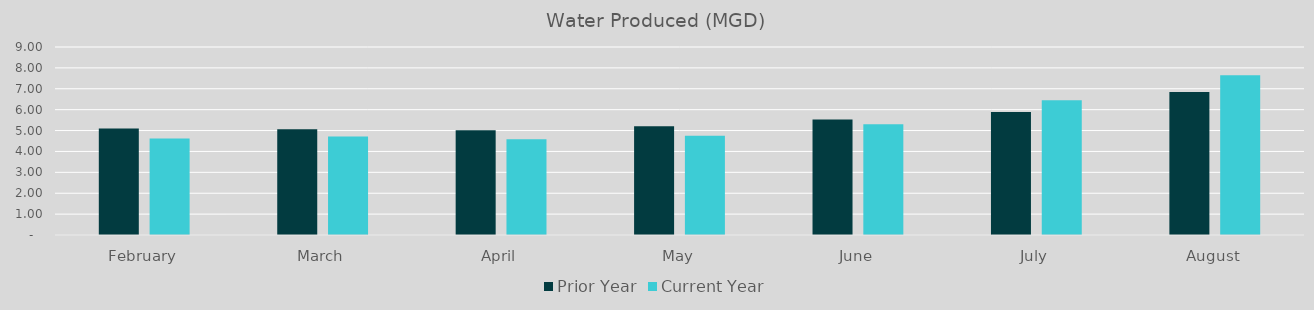
| Category | Prior Year | Current Year |
|---|---|---|
| February | 5.1 | 4.62 |
| March | 5.06 | 4.71 |
| April | 5.01 | 4.58 |
| May | 5.21 | 4.75 |
| June | 5.53 | 5.3 |
| July | 5.89 | 6.45 |
| August | 6.85 | 7.65 |